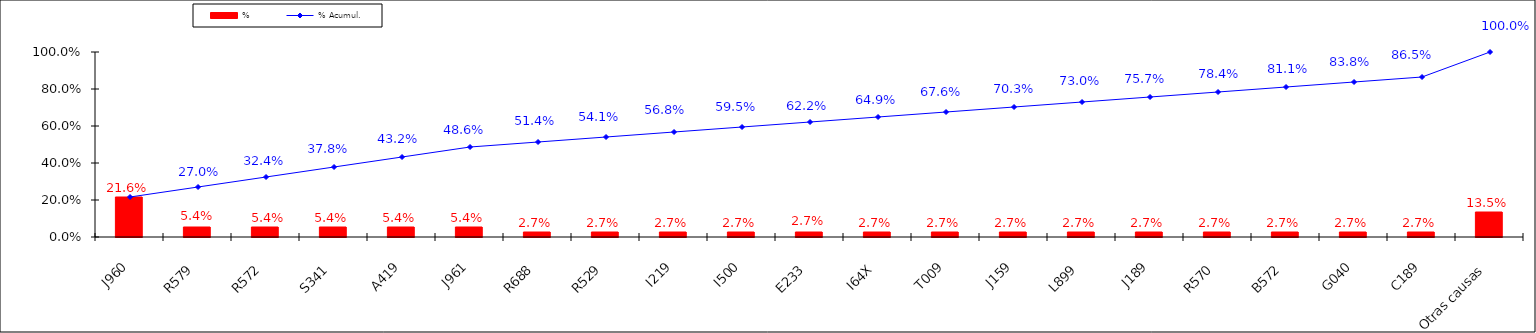
| Category | % |
|---|---|
| J960 | 0.216 |
| R579 | 0.054 |
| R572 | 0.054 |
| S341 | 0.054 |
| A419 | 0.054 |
| J961 | 0.054 |
| R688 | 0.027 |
| R529 | 0.027 |
| I219 | 0.027 |
| I500 | 0.027 |
| E233 | 0.027 |
| I64X | 0.027 |
| T009 | 0.027 |
| J159 | 0.027 |
| L899 | 0.027 |
| J189 | 0.027 |
| R570 | 0.027 |
| B572 | 0.027 |
| G040 | 0.027 |
| C189 | 0.027 |
| Otras causas | 0.135 |